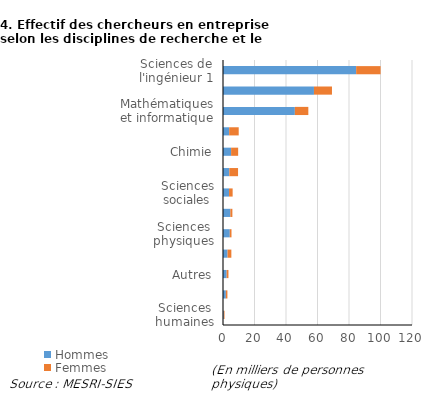
| Category | Hommes | Femmes |
|---|---|---|
| Sciences humaines | 0.475 | 0.488 |
| Sciences de la terre et Environnement | 1.812 | 0.989 |
| Autres | 2.322 | 1.14 |
| Sciences agricoles | 2.899 | 2.406 |
| Sciences physiques | 4.322 | 1.078 |
| Gestion et encadrement de la R&D | 4.665 | 1.295 |
| Sciences sociales | 3.835 | 2.288 |
| Sciences biologiques | 4.024 | 5.534 |
| Chimie | 5.148 | 4.473 |
| Sciences médicales | 3.916 | 6.059 |
| Mathématiques et informatique | 45.625 | 8.554 |
| Sciences de l'ingénieur 2 | 57.753 | 11.436 |
| Sciences de l'ingénieur 1 | 84.538 | 15.523 |